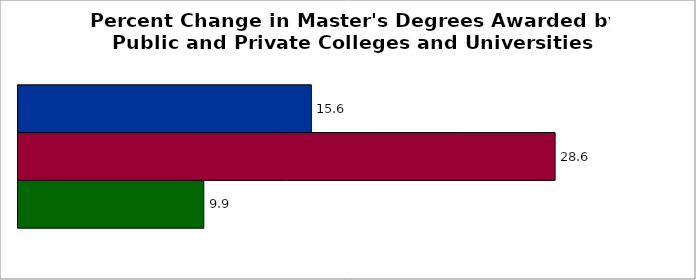
| Category | 50 states and D.C. | SREB states | State |
|---|---|---|---|
| 0 | 15.626 | 28.613 | 9.897 |